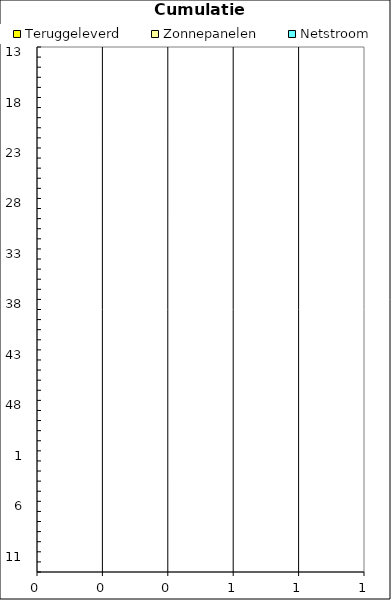
| Category | Teruggeleverd | Zonnepanelen | Netstroom |
|---|---|---|---|
| 13.0 | 0 | 0 | 0 |
| 14.0 | 0 | 0 | 0 |
| 15.0 | 0 | 0 | 0 |
| 16.0 | 0 | 0 | 0 |
| 17.0 | 0 | 0 | 0 |
| 18.0 | 0 | 0 | 0 |
| 19.0 | 0 | 0 | 0 |
| 20.0 | 0 | 0 | 0 |
| 21.0 | 0 | 0 | 0 |
| 22.0 | 0 | 0 | 0 |
| 23.0 | 0 | 0 | 0 |
| 24.0 | 0 | 0 | 0 |
| 25.0 | 0 | 0 | 0 |
| 26.0 | 0 | 0 | 0 |
| 27.0 | 0 | 0 | 0 |
| 28.0 | 0 | 0 | 0 |
| 29.0 | 0 | 0 | 0 |
| 30.0 | 0 | 0 | 0 |
| 31.0 | 0 | 0 | 0 |
| 32.0 | 0 | 0 | 0 |
| 33.0 | 0 | 0 | 0 |
| 34.0 | 0 | 0 | 0 |
| 35.0 | 0 | 0 | 0 |
| 36.0 | 0 | 0 | 0 |
| 37.0 | 0 | 0 | 0 |
| 38.0 | 0 | 0 | 0 |
| 39.0 | 0 | 0 | 0 |
| 40.0 | 0 | 0 | 0 |
| 41.0 | 0 | 0 | 0 |
| 42.0 | 0 | 0 | 0 |
| 43.0 | 0 | 0 | 0 |
| 44.0 | 0 | 0 | 0 |
| 45.0 | 0 | 0 | 0 |
| 46.0 | 0 | 0 | 0 |
| 47.0 | 0 | 0 | 0 |
| 48.0 | 0 | 0 | 0 |
| 49.0 | 0 | 0 | 0 |
| 50.0 | 0 | 0 | 0 |
| 51.0 | 0 | 0 | 0 |
| 52.0 | 0 | 0 | 0 |
| 1.0 | 0 | 0 | 0 |
| 2.0 | 0 | 0 | 0 |
| 3.0 | 0 | 0 | 0 |
| 4.0 | 0 | 0 | 0 |
| 5.0 | 0 | 0 | 0 |
| 6.0 | 0 | 0 | 0 |
| 7.0 | 0 | 0 | 0 |
| 8.0 | 0 | 0 | 0 |
| 9.0 | 0 | 0 | 0 |
| 10.0 | 0 | 0 | 0 |
| 11.0 | 0 | 0 | 0 |
| 12.0 | 0 | 0 | 0 |